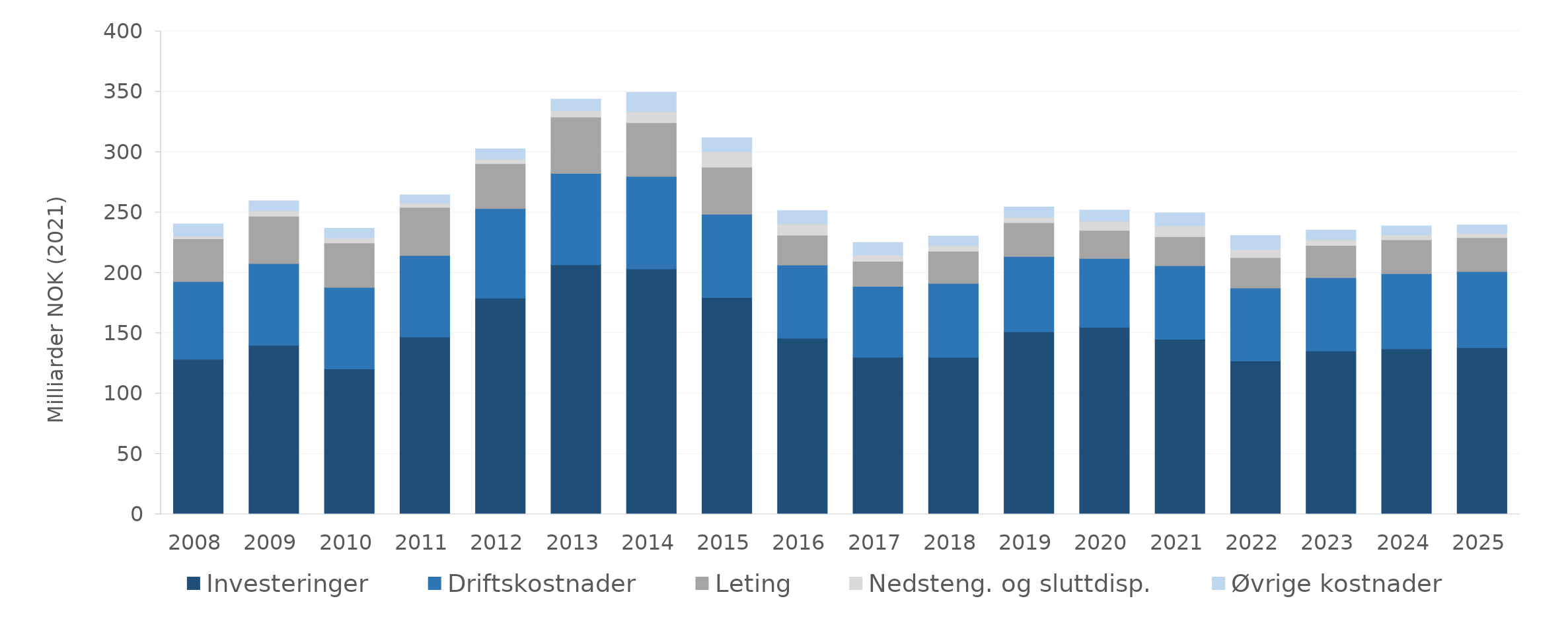
| Category | Investeringer | Driftskostnader | Leting | Nedsteng. og sluttdisp. | Øvrige kostnader |
|---|---|---|---|---|---|
| 2008.0 | 128.409 | 64.383 | 35.351 | 2.207 | 10.153 |
| 2009.0 | 139.983 | 67.614 | 39.294 | 4.618 | 8.079 |
| 2010.0 | 120.345 | 67.615 | 36.825 | 4.065 | 8.097 |
| 2011.0 | 146.976 | 67.321 | 39.862 | 3.745 | 6.693 |
| 2012.0 | 179.02 | 74.199 | 37.142 | 4.024 | 8.353 |
| 2013.0 | 206.658 | 75.644 | 46.747 | 5.095 | 9.747 |
| 2014.0 | 203.243 | 76.585 | 44.54 | 9.245 | 15.857 |
| 2015.0 | 179.537 | 69.066 | 38.959 | 12.878 | 11.472 |
| 2016.0 | 145.866 | 60.624 | 24.648 | 9.507 | 10.891 |
| 2017.0 | 130.05 | 58.8 | 20.744 | 5.356 | 10.239 |
| 2018.0 | 129.979 | 61.246 | 26.729 | 4.468 | 8.125 |
| 2019.0 | 151.175 | 62.36 | 28.026 | 4.595 | 8.479 |
| 2020.0 | 154.907 | 57.049 | 23.183 | 7.651 | 9.213 |
| 2021.0 | 145.027 | 60.862 | 24.016 | 9.107 | 10.685 |
| 2022.0 | 126.974 | 60.44 | 25.128 | 6.817 | 11.492 |
| 2023.0 | 135.317 | 60.661 | 26.75 | 4.709 | 7.991 |
| 2024.0 | 137.035 | 62.349 | 27.915 | 4.17 | 7.418 |
| 2025.0 | 138.038 | 63.018 | 28.145 | 3.548 | 6.935 |